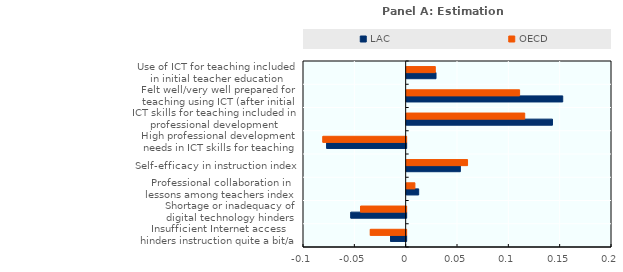
| Category | LAC | OECD |
|---|---|---|
| Insufficient Internet access hinders instruction quite a bit/a lot | -0.015 | -0.035 |
| Shortage or inadequacy of digital technology hinders instruction quite a bit/a lot | -0.054 | -0.044 |
| Professional collaboration in lessons among teachers index | 0.012 | 0.008 |
| Self-efficacy in instruction index | 0.052 | 0.059 |
| High professional development needs in ICT skills for teaching | -0.077 | -0.081 |
| ICT skills for teaching included in professional development | 0.142 | 0.115 |
| Felt well/very well prepared for teaching using ICT (after initial teacher education) | 0.152 | 0.11 |
| Use of ICT for teaching included in initial teacher education | 0.029 | 0.028 |